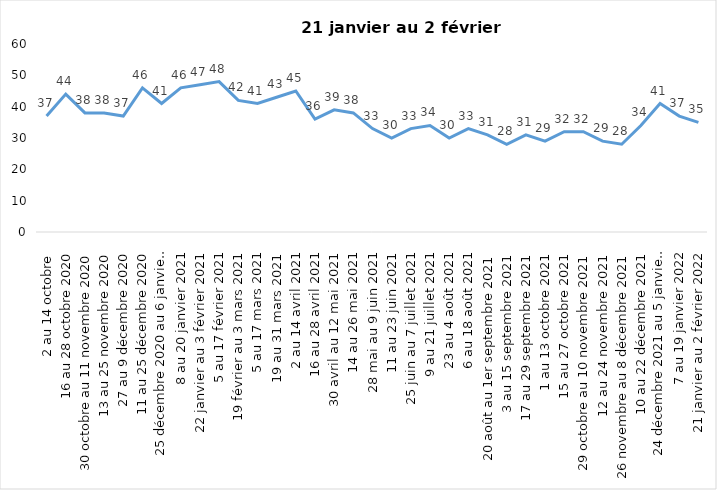
| Category | Toujours aux trois mesures |
|---|---|
| 2 au 14 octobre  | 37 |
| 16 au 28 octobre 2020 | 44 |
| 30 octobre au 11 novembre 2020 | 38 |
| 13 au 25 novembre 2020 | 38 |
| 27 au 9 décembre 2020 | 37 |
| 11 au 25 décembre 2020 | 46 |
| 25 décembre 2020 au 6 janvier 2021 | 41 |
| 8 au 20 janvier 2021 | 46 |
| 22 janvier au 3 février 2021 | 47 |
| 5 au 17 février 2021 | 48 |
| 19 février au 3 mars 2021 | 42 |
| 5 au 17 mars 2021 | 41 |
| 19 au 31 mars 2021 | 43 |
| 2 au 14 avril 2021 | 45 |
| 16 au 28 avril 2021 | 36 |
| 30 avril au 12 mai 2021 | 39 |
| 14 au 26 mai 2021 | 38 |
| 28 mai au 9 juin 2021 | 33 |
| 11 au 23 juin 2021 | 30 |
| 25 juin au 7 juillet 2021 | 33 |
| 9 au 21 juillet 2021 | 34 |
| 23 au 4 août 2021 | 30 |
| 6 au 18 août 2021 | 33 |
| 20 août au 1er septembre 2021 | 31 |
| 3 au 15 septembre 2021 | 28 |
| 17 au 29 septembre 2021 | 31 |
| 1 au 13 octobre 2021 | 29 |
| 15 au 27 octobre 2021 | 32 |
| 29 octobre au 10 novembre 2021 | 32 |
| 12 au 24 novembre 2021 | 29 |
| 26 novembre au 8 décembre 2021 | 28 |
| 10 au 22 décembre 2021 | 34 |
| 24 décembre 2021 au 5 janvier 2022 | 41 |
| 7 au 19 janvier 2022 | 37 |
| 21 janvier au 2 février 2022 | 35 |